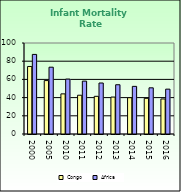
| Category | Congo | Africa |
|---|---|---|
| 2000.0 | 74.2 | 87.462 |
| 2005.0 | 58.7 | 73.418 |
| 2010.0 | 44.1 | 60.345 |
| 2011.0 | 42.6 | 58.107 |
| 2012.0 | 41.4 | 56.032 |
| 2013.0 | 40.6 | 54.131 |
| 2014.0 | 39.9 | 52.336 |
| 2015.0 | 39.2 | 50.754 |
| 2016.0 | 38.5 | 49.283 |